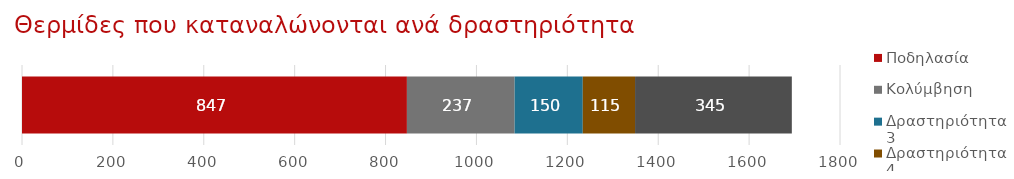
| Category | Ποδηλασία | Κολύμβηση | Δραστηριότητα 3 | Δραστηριότητα 4 | Δραστηριότητα 5 |
|---|---|---|---|---|---|
| Πρόγρ. παρακολούθ. δραστηριοτ. | 847 | 237 | 150 | 115 | 345 |